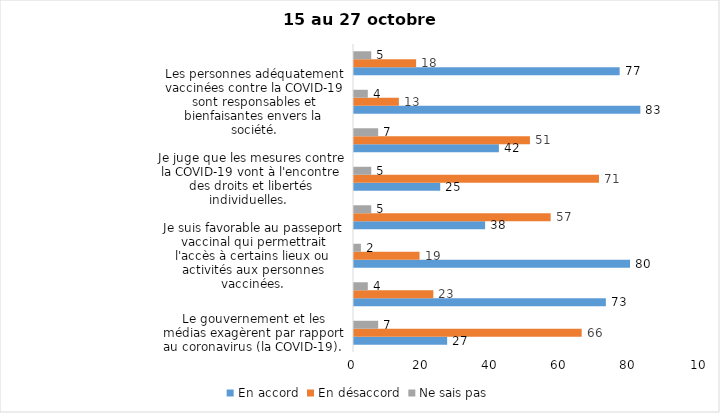
| Category | En accord | En désaccord | Ne sais pas |
|---|---|---|---|
| Le gouvernement et les médias exagèrent par rapport au coronavirus (la COVID-19). | 27 | 66 | 7 |
| J’ai peur que le système de santé soit débordé par les cas de COVID-19. | 73 | 23 | 4 |
| Je suis favorable au passeport vaccinal qui permettrait l'accès à certains lieux ou activités aux personnes vaccinées. | 80 | 19 | 2 |
| Je suis favorable à ce que le port du masque ne soit plus obligatoire au Québec. | 38 | 57 | 5 |
| Je juge que les mesures contre la COVID-19 vont à l'encontre des droits et libertés individuelles.  | 25 | 71 | 5 |
| Je pense que le gouvernement du Québec devrait mettre fin à l’état d’urgence sanitaire.  | 42 | 51 | 7 |
| Les personnes adéquatement vaccinées contre la COVID-19 sont responsables et bienfaisantes envers la société. | 83 | 13 | 4 |
| Les personnes non adéquatement vaccinées contre la COVID-19 sont responsables des novueaux cas et hospitalisations et contribuent à la prolongation de la pandémie au Québec. | 77 | 18 | 5 |